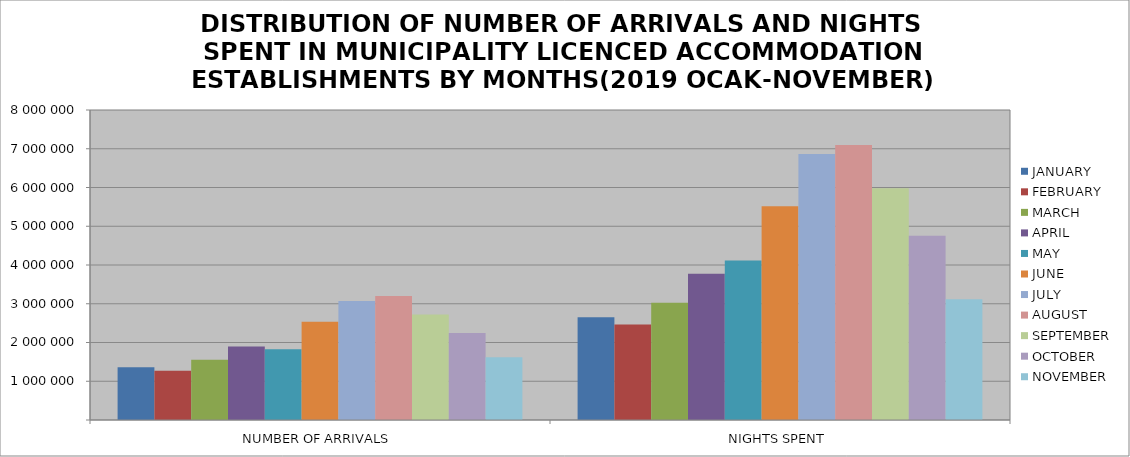
| Category | JANUARY | FEBRUARY | MARCH | APRIL | MAY | JUNE | JULY | AUGUST | SEPTEMBER | OCTOBER | NOVEMBER |
|---|---|---|---|---|---|---|---|---|---|---|---|
| NUMBER OF ARRIVALS | 1363187 | 1273727 | 1552518 | 1898202 | 1826154 | 2537491 | 3073499 | 3201724 | 2721047 | 2242115 | 1617176 |
| NIGHTS SPENT | 2649437 | 2462023 | 3024704 | 3772615 | 4117532 | 5513568 | 6866550 | 7097153 | 5980815 | 4758060 | 3114074 |